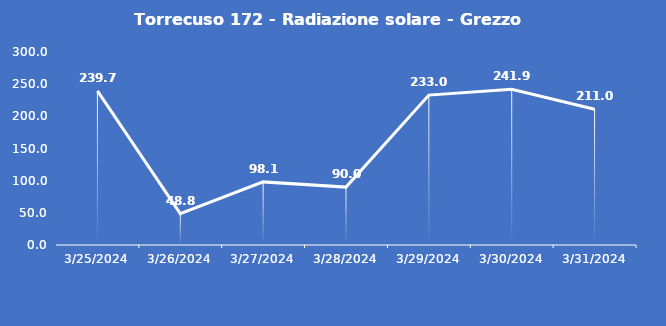
| Category | Torrecuso 172 - Radiazione solare - Grezzo (W/m2) |
|---|---|
| 3/25/24 | 239.7 |
| 3/26/24 | 48.8 |
| 3/27/24 | 98.1 |
| 3/28/24 | 90 |
| 3/29/24 | 233 |
| 3/30/24 | 241.9 |
| 3/31/24 | 211 |